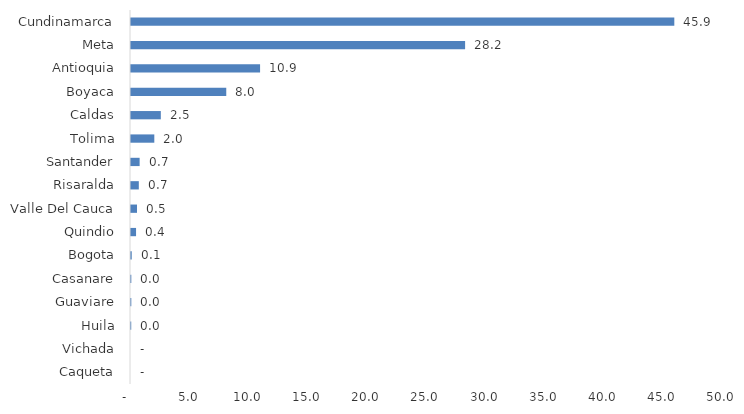
| Category | Series 0 |
|---|---|
| Caqueta | 0 |
| Vichada | 0 |
| Huila | 0.02 |
| Guaviare | 0.026 |
| Casanare | 0.026 |
| Bogota | 0.061 |
| Quindio | 0.427 |
| Valle Del Cauca | 0.509 |
| Risaralda | 0.66 |
| Santander | 0.729 |
| Tolima | 1.969 |
| Caldas | 2.519 |
| Boyaca | 8.046 |
| Antioquia | 10.902 |
| Meta | 28.219 |
| Cundinamarca | 45.888 |